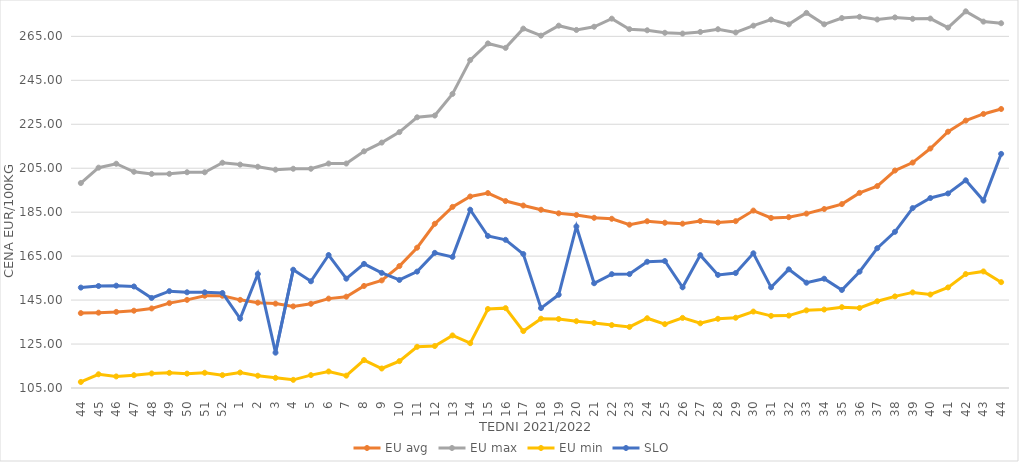
| Category | EU avg | EU max | EU min | SLO |
|---|---|---|---|---|
| 44.0 | 139.076 | 198.26 | 107.75 | 150.69 |
| 45.0 | 139.275 | 205.257 | 111.25 | 151.41 |
| 46.0 | 139.626 | 207.046 | 110.26 | 151.56 |
| 47.0 | 140.17 | 203.387 | 110.83 | 151.2 |
| 48.0 | 141.2 | 202.42 | 111.62 | 145.97 |
| 49.0 | 143.614 | 202.45 | 111.89 | 149.07 |
| 50.0 | 145.101 | 203.17 | 111.54 | 148.55 |
| 51.0 | 146.984 | 203.17 | 111.93 | 148.54 |
| 52.0 | 146.958 | 207.5 | 110.85 | 148.22 |
| 1.0 | 145.11 | 206.66 | 112.04 | 136.59 |
| 2.0 | 143.822 | 205.67 | 110.59 | 156.88 |
| 3.0 | 143.402 | 204.34 | 109.62 | 121.07 |
| 4.0 | 142.134 | 204.76 | 108.71 | 158.82 |
| 5.0 | 143.314 | 204.76 | 110.86 | 153.55 |
| 6.0 | 145.677 | 207.14 | 112.52 | 165.51 |
| 7.0 | 146.556 | 207.14 | 110.619 | 154.74 |
| 8.0 | 151.439 | 212.7 | 117.709 | 161.48 |
| 9.0 | 153.947 | 216.67 | 113.871 | 157.38 |
| 10.0 | 160.496 | 221.43 | 117.233 | 154.16 |
| 11.0 | 168.845 | 228.17 | 123.737 | 157.96 |
| 12.0 | 179.714 | 228.97 | 124.105 | 166.49 |
| 13.0 | 187.409 | 238.81 | 128.918 | 164.66 |
| 14.0 | 192.137 | 254.21 | 125.399 | 186.11 |
| 15.0 | 193.697 | 261.79 | 140.954 | 174.18 |
| 16.0 | 190.066 | 259.76 | 141.337 | 172.42 |
| 17.0 | 188.031 | 268.52 | 130.897 | 165.96 |
| 18.0 | 186.119 | 265.34 | 136.529 | 141.36 |
| 19.0 | 184.47 | 269.87 | 136.387 | 147.43 |
| 20.0 | 183.734 | 267.92 | 135.392 | 178.51 |
| 21.0 | 182.45 | 269.38 | 134.589 | 152.67 |
| 22.0 | 181.991 | 273.06 | 133.621 | 156.8 |
| 23.0 | 179.308 | 268.27 | 132.787 | 156.84 |
| 24.0 | 180.886 | 267.77 | 136.75 | 162.44 |
| 25.0 | 180.2 | 266.63 | 134.058 | 162.78 |
| 26.0 | 179.77 | 266.27 | 136.895 | 150.82 |
| 27.0 | 180.992 | 267.02 | 134.44 | 165.45 |
| 28.0 | 180.305 | 268.25 | 136.486 | 156.46 |
| 29.0 | 180.913 | 266.77 | 136.97 | 157.31 |
| 30.0 | 185.728 | 269.87 | 139.777 | 166.29 |
| 31.0 | 182.385 | 272.64 | 137.828 | 150.81 |
| 32.0 | 182.73 | 270.47 | 137.934 | 158.99 |
| 33.0 | 184.343 | 275.68 | 140.33 | 152.91 |
| 34.0 | 186.448 | 270.49 | 140.7 | 154.73 |
| 35.0 | 188.684 | 273.33 | 141.78 | 149.6 |
| 36.0 | 193.792 | 273.91 | 141.41 | 157.93 |
| 37.0 | 196.877 | 272.67 | 144.47 | 168.61 |
| 38.0 | 203.962 | 273.63 | 146.68 | 176.07 |
| 39.0 | 207.572 | 272.98 | 148.499 | 186.86 |
| 40.0 | 213.977 | 273.1 | 147.54 | 191.45 |
| 41.0 | 221.625 | 268.98 | 150.75 | 193.52 |
| 42.0 | 226.676 | 276.39 | 156.848 | 199.51 |
| 43.0 | 229.702 | 271.72 | 158.04 | 190.28 |
| 44.0 | 231.961 | 270.98 | 153.16 | 211.53 |